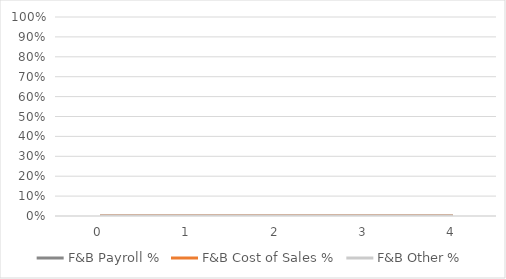
| Category | F&B Payroll % | F&B Cost of Sales % | F&B Other % |
|---|---|---|---|
| 0.0 | 0 | 0 | 0 |
| 1.0 | 0 | 0 | 0 |
| 2.0 | 0 | 0 | 0 |
| 3.0 | 0 | 0 | 0 |
| 4.0 | 0 | 0 | 0 |